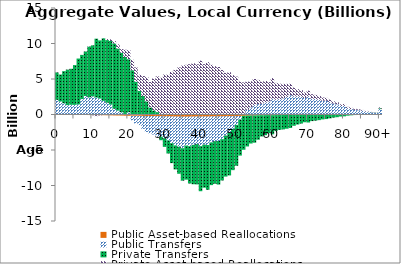
| Category | Public Asset-based Reallocations | Public Transfers | Private Transfers | Private Asset-based Reallocations |
|---|---|---|---|---|
| 0 | -40.298 | 2059.589 | 3872.87 | 1.502 |
|  | -39.683 | 1841.842 | 3787.881 | 3.111 |
| 2 | -48.056 | 1581.781 | 4519.856 | 1.719 |
| 3 | -53.477 | 1323.365 | 5002.955 | 0.562 |
| 4 | -53.613 | 1369.942 | 5071.654 | -15.955 |
| 5 | -59.717 | 1360.221 | 5601.144 | 5.501 |
| 6 | -69.699 | 1425.574 | 6457.478 | 2.546 |
| 7 | -66.2 | 2174.43 | 6220.452 | 6.954 |
| 8 | -66.133 | 2602.394 | 6274.897 | 6.534 |
| 9 | -77.576 | 2422.544 | 7147.437 | 56.429 |
| 10 | -77.151 | 2559.298 | 7182.294 | -44.951 |
| 11 | -91.361 | 2393.297 | 8286.237 | -144.882 |
| 12 | -90.595 | 2250.662 | 8186.877 | -53.069 |
| 13 | -100.334 | 1922.152 | 8816.731 | 22.846 |
| 14 | -108.456 | 1655.644 | 8824.179 | 142.806 |
| 15 | -120.318 | 1402.803 | 8954.854 | 231.993 |
| 16 | -131.902 | 808.857 | 9194.311 | 326.138 |
| 17 | -141.322 | 555.675 | 8740.006 | 585.843 |
| 18 | -153.031 | 320.649 | 8376.89 | 511.686 |
| 19 | -169.289 | 77.885 | 8026.062 | 1012.16 |
| 20 | -182.43 | 317.216 | 7470.977 | 1271.693 |
| 21 | -182.776 | -633.225 | 6231.829 | 1472.568 |
| 22 | -187.011 | -1069.656 | 4631.793 | 2005.89 |
| 23 | -190.072 | -1295.276 | 3330.491 | 2276.085 |
| 24 | -205.133 | -1826.311 | 2618.433 | 2807.261 |
| 25 | -227.32 | -2235.222 | 1849.749 | 3417.084 |
| 26 | -227.016 | -2448.989 | 998.59 | 3580.012 |
| 27 | -239.805 | -2584.137 | 580.429 | 4486.409 |
| 28 | -241.631 | -2899.163 | 335.79 | 5025.959 |
| 29 | -237.884 | -2873.203 | -512.473 | 5171.336 |
| 30 | -260.251 | -3072.6 | -1225.36 | 5630.354 |
| 31 | -263.242 | -3392.849 | -1840.016 | 5599.763 |
| 32 | -284.207 | -3763.972 | -2800.996 | 6021.618 |
| 33 | -292.13 | -4063.408 | -3384.885 | 6291.608 |
| 34 | -302.921 | -4238.059 | -3808.764 | 6629.538 |
| 35 | -312.468 | -4437.409 | -4572.962 | 6890.649 |
| 36 | -311.691 | -4059.257 | -4806.701 | 6994.746 |
| 37 | -302.274 | -4167.936 | -5250.74 | 7082.263 |
| 38 | -297.371 | -3978.657 | -5549.412 | 7215.365 |
| 39 | -287.195 | -3878.965 | -5680.547 | 7077.567 |
| 40 | -302.344 | -4154.2 | -6349.749 | 7590.231 |
| 41 | -286.227 | -3951.606 | -6066.73 | 7089.818 |
| 42 | -292.816 | -4007.273 | -6305.385 | 7373.823 |
| 43 | -272.373 | -3663.025 | -6011.537 | 6992.931 |
| 44 | -267.354 | -3486.904 | -6006.573 | 6805.949 |
| 45 | -272.792 | -3453.066 | -6141.592 | 6692.46 |
| 46 | -267.224 | -3210.324 | -5818.752 | 6272.741 |
| 47 | -254.163 | -2710.344 | -5778.819 | 5866.689 |
| 48 | -251.083 | -2288.631 | -6044.33 | 5949.645 |
| 49 | -237.883 | -1784.137 | -5815.933 | 5534.757 |
| 50 | -234.174 | -1229.563 | -5756.088 | 5334.94 |
| 51 | -203.01 | -511.59 | -5074.034 | 4644.702 |
| 52 | -183.653 | 109.53 | -4782.111 | 4410.527 |
| 53 | -159.411 | 661.675 | -4342.257 | 3973.35 |
| 54 | -140.078 | 1013.646 | -3947.262 | 3668.947 |
| 55 | -132.721 | 1325.271 | -3838.941 | 3676.301 |
| 56 | -115.209 | 1464.917 | -3434.72 | 3407.78 |
| 57 | -98.976 | 1515.643 | -2997.73 | 3117.355 |
| 58 | -94.016 | 1701.539 | -2817.945 | 3014.157 |
| 59 | -87.219 | 1817.945 | -2544.62 | 2743.429 |
| 60 | -94.123 | 2225.025 | -2690.673 | 2904.45 |
| 61 | -80.14 | 2081.017 | -2222.098 | 2374.734 |
| 62 | -76.174 | 2149.434 | -2088.261 | 2193.589 |
| 63 | -74.495 | 2261.667 | -2022.581 | 2055.03 |
| 64 | -73.065 | 2475.009 | -1929.134 | 1843.859 |
| 65 | -72.4 | 2721.515 | -1824.8 | 1607.388 |
| 66 | -62.736 | 2555.186 | -1527.885 | 1241.46 |
| 67 | -57.785 | 2524.73 | -1354.526 | 1045.612 |
| 68 | -53.928 | 2473.467 | -1227.798 | 949.055 |
| 69 | -48.581 | 2325.079 | -1045.215 | 796.113 |
| 70 | -51.29 | 2556.965 | -1076.544 | 811.14 |
| 71 | -42.899 | 2221.484 | -885.803 | 640.53 |
| 72 | -40.556 | 2183.307 | -830.005 | 582.366 |
| 73 | -37.535 | 2085.677 | -753.939 | 532.748 |
| 74 | -33.477 | 1944.228 | -658.879 | 450.589 |
| 75 | -31.951 | 1928.673 | -610.7 | 405.862 |
| 76 | -28.13 | 1756.831 | -517.425 | 348.859 |
| 77 | -23.982 | 1547.408 | -418.689 | 298.752 |
| 78 | -21.774 | 1441.016 | -354.837 | 282.653 |
| 79 | -17.729 | 1197.477 | -265.75 | 242.7 |
| 80 | -17.912 | 1224.346 | -240.543 | 259.129 |
| 81 | -12.838 | 886.374 | -148.886 | 189.574 |
| 82 | -11.057 | 766.635 | -104.888 | 164.756 |
| 83 | -9.377 | 652.977 | -68.109 | 140.668 |
| 84 | -8.591 | 600.956 | -42.471 | 128.832 |
| 85 | -7.564 | 530.92 | -17.883 | 108.15 |
| 86 | -6.056 | 425.637 | 1.394 | 84.75 |
| 87 | -4.788 | 337.876 | 13.804 | 66.366 |
| 88 | -3.84 | 272.261 | 21.386 | 52.179 |
| 89 | -3.008 | 215.458 | 24.937 | 40.219 |
| 90+ | -10.678 | 764.333 | 116.107 | 129.379 |